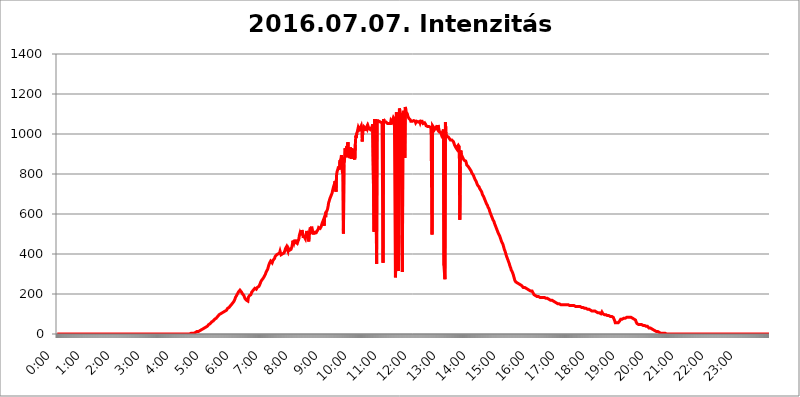
| Category | 2016.07.07. Intenzitás [W/m^2] |
|---|---|
| 0.0 | 0 |
| 0.0006944444444444445 | 0 |
| 0.001388888888888889 | 0 |
| 0.0020833333333333333 | 0 |
| 0.002777777777777778 | 0 |
| 0.003472222222222222 | 0 |
| 0.004166666666666667 | 0 |
| 0.004861111111111111 | 0 |
| 0.005555555555555556 | 0 |
| 0.0062499999999999995 | 0 |
| 0.006944444444444444 | 0 |
| 0.007638888888888889 | 0 |
| 0.008333333333333333 | 0 |
| 0.009027777777777779 | 0 |
| 0.009722222222222222 | 0 |
| 0.010416666666666666 | 0 |
| 0.011111111111111112 | 0 |
| 0.011805555555555555 | 0 |
| 0.012499999999999999 | 0 |
| 0.013194444444444444 | 0 |
| 0.013888888888888888 | 0 |
| 0.014583333333333332 | 0 |
| 0.015277777777777777 | 0 |
| 0.015972222222222224 | 0 |
| 0.016666666666666666 | 0 |
| 0.017361111111111112 | 0 |
| 0.018055555555555557 | 0 |
| 0.01875 | 0 |
| 0.019444444444444445 | 0 |
| 0.02013888888888889 | 0 |
| 0.020833333333333332 | 0 |
| 0.02152777777777778 | 0 |
| 0.022222222222222223 | 0 |
| 0.02291666666666667 | 0 |
| 0.02361111111111111 | 0 |
| 0.024305555555555556 | 0 |
| 0.024999999999999998 | 0 |
| 0.025694444444444447 | 0 |
| 0.02638888888888889 | 0 |
| 0.027083333333333334 | 0 |
| 0.027777777777777776 | 0 |
| 0.02847222222222222 | 0 |
| 0.029166666666666664 | 0 |
| 0.029861111111111113 | 0 |
| 0.030555555555555555 | 0 |
| 0.03125 | 0 |
| 0.03194444444444445 | 0 |
| 0.03263888888888889 | 0 |
| 0.03333333333333333 | 0 |
| 0.034027777777777775 | 0 |
| 0.034722222222222224 | 0 |
| 0.035416666666666666 | 0 |
| 0.036111111111111115 | 0 |
| 0.03680555555555556 | 0 |
| 0.0375 | 0 |
| 0.03819444444444444 | 0 |
| 0.03888888888888889 | 0 |
| 0.03958333333333333 | 0 |
| 0.04027777777777778 | 0 |
| 0.04097222222222222 | 0 |
| 0.041666666666666664 | 0 |
| 0.042361111111111106 | 0 |
| 0.04305555555555556 | 0 |
| 0.043750000000000004 | 0 |
| 0.044444444444444446 | 0 |
| 0.04513888888888889 | 0 |
| 0.04583333333333334 | 0 |
| 0.04652777777777778 | 0 |
| 0.04722222222222222 | 0 |
| 0.04791666666666666 | 0 |
| 0.04861111111111111 | 0 |
| 0.049305555555555554 | 0 |
| 0.049999999999999996 | 0 |
| 0.05069444444444445 | 0 |
| 0.051388888888888894 | 0 |
| 0.052083333333333336 | 0 |
| 0.05277777777777778 | 0 |
| 0.05347222222222222 | 0 |
| 0.05416666666666667 | 0 |
| 0.05486111111111111 | 0 |
| 0.05555555555555555 | 0 |
| 0.05625 | 0 |
| 0.05694444444444444 | 0 |
| 0.057638888888888885 | 0 |
| 0.05833333333333333 | 0 |
| 0.05902777777777778 | 0 |
| 0.059722222222222225 | 0 |
| 0.06041666666666667 | 0 |
| 0.061111111111111116 | 0 |
| 0.06180555555555556 | 0 |
| 0.0625 | 0 |
| 0.06319444444444444 | 0 |
| 0.06388888888888888 | 0 |
| 0.06458333333333334 | 0 |
| 0.06527777777777778 | 0 |
| 0.06597222222222222 | 0 |
| 0.06666666666666667 | 0 |
| 0.06736111111111111 | 0 |
| 0.06805555555555555 | 0 |
| 0.06874999999999999 | 0 |
| 0.06944444444444443 | 0 |
| 0.07013888888888889 | 0 |
| 0.07083333333333333 | 0 |
| 0.07152777777777779 | 0 |
| 0.07222222222222223 | 0 |
| 0.07291666666666667 | 0 |
| 0.07361111111111111 | 0 |
| 0.07430555555555556 | 0 |
| 0.075 | 0 |
| 0.07569444444444444 | 0 |
| 0.0763888888888889 | 0 |
| 0.07708333333333334 | 0 |
| 0.07777777777777778 | 0 |
| 0.07847222222222222 | 0 |
| 0.07916666666666666 | 0 |
| 0.0798611111111111 | 0 |
| 0.08055555555555556 | 0 |
| 0.08125 | 0 |
| 0.08194444444444444 | 0 |
| 0.08263888888888889 | 0 |
| 0.08333333333333333 | 0 |
| 0.08402777777777777 | 0 |
| 0.08472222222222221 | 0 |
| 0.08541666666666665 | 0 |
| 0.08611111111111112 | 0 |
| 0.08680555555555557 | 0 |
| 0.08750000000000001 | 0 |
| 0.08819444444444445 | 0 |
| 0.08888888888888889 | 0 |
| 0.08958333333333333 | 0 |
| 0.09027777777777778 | 0 |
| 0.09097222222222222 | 0 |
| 0.09166666666666667 | 0 |
| 0.09236111111111112 | 0 |
| 0.09305555555555556 | 0 |
| 0.09375 | 0 |
| 0.09444444444444444 | 0 |
| 0.09513888888888888 | 0 |
| 0.09583333333333333 | 0 |
| 0.09652777777777777 | 0 |
| 0.09722222222222222 | 0 |
| 0.09791666666666667 | 0 |
| 0.09861111111111111 | 0 |
| 0.09930555555555555 | 0 |
| 0.09999999999999999 | 0 |
| 0.10069444444444443 | 0 |
| 0.1013888888888889 | 0 |
| 0.10208333333333335 | 0 |
| 0.10277777777777779 | 0 |
| 0.10347222222222223 | 0 |
| 0.10416666666666667 | 0 |
| 0.10486111111111111 | 0 |
| 0.10555555555555556 | 0 |
| 0.10625 | 0 |
| 0.10694444444444444 | 0 |
| 0.1076388888888889 | 0 |
| 0.10833333333333334 | 0 |
| 0.10902777777777778 | 0 |
| 0.10972222222222222 | 0 |
| 0.1111111111111111 | 0 |
| 0.11180555555555556 | 0 |
| 0.11180555555555556 | 0 |
| 0.1125 | 0 |
| 0.11319444444444444 | 0 |
| 0.11388888888888889 | 0 |
| 0.11458333333333333 | 0 |
| 0.11527777777777777 | 0 |
| 0.11597222222222221 | 0 |
| 0.11666666666666665 | 0 |
| 0.1173611111111111 | 0 |
| 0.11805555555555557 | 0 |
| 0.11944444444444445 | 0 |
| 0.12013888888888889 | 0 |
| 0.12083333333333333 | 0 |
| 0.12152777777777778 | 0 |
| 0.12222222222222223 | 0 |
| 0.12291666666666667 | 0 |
| 0.12291666666666667 | 0 |
| 0.12361111111111112 | 0 |
| 0.12430555555555556 | 0 |
| 0.125 | 0 |
| 0.12569444444444444 | 0 |
| 0.12638888888888888 | 0 |
| 0.12708333333333333 | 0 |
| 0.16875 | 0 |
| 0.12847222222222224 | 0 |
| 0.12916666666666668 | 0 |
| 0.12986111111111112 | 0 |
| 0.13055555555555556 | 0 |
| 0.13125 | 0 |
| 0.13194444444444445 | 0 |
| 0.1326388888888889 | 0 |
| 0.13333333333333333 | 0 |
| 0.13402777777777777 | 0 |
| 0.13402777777777777 | 0 |
| 0.13472222222222222 | 0 |
| 0.13541666666666666 | 0 |
| 0.1361111111111111 | 0 |
| 0.13749999999999998 | 0 |
| 0.13819444444444443 | 0 |
| 0.1388888888888889 | 0 |
| 0.13958333333333334 | 0 |
| 0.14027777777777778 | 0 |
| 0.14097222222222222 | 0 |
| 0.14166666666666666 | 0 |
| 0.1423611111111111 | 0 |
| 0.14305555555555557 | 0 |
| 0.14375000000000002 | 0 |
| 0.14444444444444446 | 0 |
| 0.1451388888888889 | 0 |
| 0.1451388888888889 | 0 |
| 0.14652777777777778 | 0 |
| 0.14722222222222223 | 0 |
| 0.14791666666666667 | 0 |
| 0.1486111111111111 | 0 |
| 0.14930555555555555 | 0 |
| 0.15 | 0 |
| 0.15069444444444444 | 0 |
| 0.15138888888888888 | 0 |
| 0.15208333333333332 | 0 |
| 0.15277777777777776 | 0 |
| 0.15347222222222223 | 0 |
| 0.15416666666666667 | 0 |
| 0.15486111111111112 | 0 |
| 0.15555555555555556 | 0 |
| 0.15625 | 0 |
| 0.15694444444444444 | 0 |
| 0.15763888888888888 | 0 |
| 0.15833333333333333 | 0 |
| 0.15902777777777777 | 0 |
| 0.15972222222222224 | 0 |
| 0.16041666666666668 | 0 |
| 0.16111111111111112 | 0 |
| 0.16180555555555556 | 0 |
| 0.1625 | 0 |
| 0.16319444444444445 | 0 |
| 0.1638888888888889 | 0 |
| 0.16458333333333333 | 0 |
| 0.16527777777777777 | 0 |
| 0.16597222222222222 | 0 |
| 0.16666666666666666 | 0 |
| 0.1673611111111111 | 0 |
| 0.16805555555555554 | 0 |
| 0.16874999999999998 | 0 |
| 0.16944444444444443 | 0 |
| 0.17013888888888887 | 0 |
| 0.1708333333333333 | 0 |
| 0.17152777777777775 | 0 |
| 0.17222222222222225 | 0 |
| 0.1729166666666667 | 0 |
| 0.17361111111111113 | 0 |
| 0.17430555555555557 | 0 |
| 0.17500000000000002 | 0 |
| 0.17569444444444446 | 0 |
| 0.1763888888888889 | 0 |
| 0.17708333333333334 | 0 |
| 0.17777777777777778 | 0 |
| 0.17847222222222223 | 0 |
| 0.17916666666666667 | 0 |
| 0.1798611111111111 | 0 |
| 0.18055555555555555 | 0 |
| 0.18125 | 0 |
| 0.18194444444444444 | 0 |
| 0.1826388888888889 | 0 |
| 0.18333333333333335 | 0 |
| 0.1840277777777778 | 0 |
| 0.18472222222222223 | 3.525 |
| 0.18541666666666667 | 0 |
| 0.18611111111111112 | 3.525 |
| 0.18680555555555556 | 3.525 |
| 0.1875 | 3.525 |
| 0.18819444444444444 | 3.525 |
| 0.18888888888888888 | 3.525 |
| 0.18958333333333333 | 3.525 |
| 0.19027777777777777 | 3.525 |
| 0.1909722222222222 | 3.525 |
| 0.19166666666666665 | 3.525 |
| 0.19236111111111112 | 7.887 |
| 0.19305555555555554 | 7.887 |
| 0.19375 | 7.887 |
| 0.19444444444444445 | 7.887 |
| 0.1951388888888889 | 7.887 |
| 0.19583333333333333 | 12.257 |
| 0.19652777777777777 | 12.257 |
| 0.19722222222222222 | 12.257 |
| 0.19791666666666666 | 12.257 |
| 0.1986111111111111 | 12.257 |
| 0.19930555555555554 | 16.636 |
| 0.19999999999999998 | 16.636 |
| 0.20069444444444443 | 21.024 |
| 0.20138888888888887 | 21.024 |
| 0.2020833333333333 | 21.024 |
| 0.2027777777777778 | 21.024 |
| 0.2034722222222222 | 25.419 |
| 0.2041666666666667 | 25.419 |
| 0.20486111111111113 | 25.419 |
| 0.20555555555555557 | 29.823 |
| 0.20625000000000002 | 29.823 |
| 0.20694444444444446 | 29.823 |
| 0.2076388888888889 | 29.823 |
| 0.20833333333333334 | 34.234 |
| 0.20902777777777778 | 34.234 |
| 0.20972222222222223 | 38.653 |
| 0.21041666666666667 | 38.653 |
| 0.2111111111111111 | 43.079 |
| 0.21180555555555555 | 43.079 |
| 0.2125 | 47.511 |
| 0.21319444444444444 | 47.511 |
| 0.2138888888888889 | 51.951 |
| 0.21458333333333335 | 51.951 |
| 0.2152777777777778 | 56.398 |
| 0.21597222222222223 | 56.398 |
| 0.21666666666666667 | 60.85 |
| 0.21736111111111112 | 60.85 |
| 0.21805555555555556 | 65.31 |
| 0.21875 | 65.31 |
| 0.21944444444444444 | 69.775 |
| 0.22013888888888888 | 69.775 |
| 0.22083333333333333 | 74.246 |
| 0.22152777777777777 | 74.246 |
| 0.2222222222222222 | 78.722 |
| 0.22291666666666665 | 78.722 |
| 0.2236111111111111 | 83.205 |
| 0.22430555555555556 | 83.205 |
| 0.225 | 87.692 |
| 0.22569444444444445 | 92.184 |
| 0.2263888888888889 | 92.184 |
| 0.22708333333333333 | 96.682 |
| 0.22777777777777777 | 96.682 |
| 0.22847222222222222 | 101.184 |
| 0.22916666666666666 | 101.184 |
| 0.2298611111111111 | 105.69 |
| 0.23055555555555554 | 105.69 |
| 0.23124999999999998 | 105.69 |
| 0.23194444444444443 | 110.201 |
| 0.23263888888888887 | 110.201 |
| 0.2333333333333333 | 110.201 |
| 0.2340277777777778 | 114.716 |
| 0.2347222222222222 | 114.716 |
| 0.2354166666666667 | 114.716 |
| 0.23611111111111113 | 119.235 |
| 0.23680555555555557 | 119.235 |
| 0.23750000000000002 | 119.235 |
| 0.23819444444444446 | 123.758 |
| 0.2388888888888889 | 128.284 |
| 0.23958333333333334 | 128.284 |
| 0.24027777777777778 | 128.284 |
| 0.24097222222222223 | 132.814 |
| 0.24166666666666667 | 137.347 |
| 0.2423611111111111 | 137.347 |
| 0.24305555555555555 | 141.884 |
| 0.24375 | 146.423 |
| 0.24444444444444446 | 146.423 |
| 0.24513888888888888 | 150.964 |
| 0.24583333333333335 | 150.964 |
| 0.2465277777777778 | 155.509 |
| 0.24722222222222223 | 160.056 |
| 0.24791666666666667 | 164.605 |
| 0.24861111111111112 | 169.156 |
| 0.24930555555555556 | 173.709 |
| 0.25 | 182.82 |
| 0.25069444444444444 | 182.82 |
| 0.2513888888888889 | 191.937 |
| 0.2520833333333333 | 196.497 |
| 0.25277777777777777 | 201.058 |
| 0.2534722222222222 | 201.058 |
| 0.25416666666666665 | 210.182 |
| 0.2548611111111111 | 210.182 |
| 0.2555555555555556 | 214.746 |
| 0.25625000000000003 | 219.309 |
| 0.2569444444444445 | 219.309 |
| 0.2576388888888889 | 214.746 |
| 0.25833333333333336 | 210.182 |
| 0.2590277777777778 | 205.62 |
| 0.25972222222222224 | 201.058 |
| 0.2604166666666667 | 196.497 |
| 0.2611111111111111 | 196.497 |
| 0.26180555555555557 | 191.937 |
| 0.2625 | 191.937 |
| 0.26319444444444445 | 178.264 |
| 0.2638888888888889 | 173.709 |
| 0.26458333333333334 | 173.709 |
| 0.2652777777777778 | 169.156 |
| 0.2659722222222222 | 164.605 |
| 0.26666666666666666 | 169.156 |
| 0.2673611111111111 | 164.605 |
| 0.26805555555555555 | 182.82 |
| 0.26875 | 178.264 |
| 0.26944444444444443 | 191.937 |
| 0.2701388888888889 | 196.497 |
| 0.2708333333333333 | 196.497 |
| 0.27152777777777776 | 196.497 |
| 0.2722222222222222 | 201.058 |
| 0.27291666666666664 | 210.182 |
| 0.2736111111111111 | 214.746 |
| 0.2743055555555555 | 214.746 |
| 0.27499999999999997 | 219.309 |
| 0.27569444444444446 | 223.873 |
| 0.27638888888888885 | 223.873 |
| 0.27708333333333335 | 228.436 |
| 0.2777777777777778 | 228.436 |
| 0.27847222222222223 | 228.436 |
| 0.2791666666666667 | 223.873 |
| 0.2798611111111111 | 228.436 |
| 0.28055555555555556 | 233 |
| 0.28125 | 237.564 |
| 0.28194444444444444 | 233 |
| 0.2826388888888889 | 237.564 |
| 0.2833333333333333 | 242.127 |
| 0.28402777777777777 | 246.689 |
| 0.2847222222222222 | 251.251 |
| 0.28541666666666665 | 260.373 |
| 0.28611111111111115 | 264.932 |
| 0.28680555555555554 | 269.49 |
| 0.28750000000000003 | 269.49 |
| 0.2881944444444445 | 274.047 |
| 0.2888888888888889 | 278.603 |
| 0.28958333333333336 | 278.603 |
| 0.2902777777777778 | 287.709 |
| 0.29097222222222224 | 287.709 |
| 0.2916666666666667 | 296.808 |
| 0.2923611111111111 | 292.259 |
| 0.29305555555555557 | 310.44 |
| 0.29375 | 314.98 |
| 0.29444444444444445 | 314.98 |
| 0.2951388888888889 | 324.052 |
| 0.29583333333333334 | 333.113 |
| 0.2965277777777778 | 342.162 |
| 0.2972222222222222 | 346.682 |
| 0.29791666666666666 | 355.712 |
| 0.2986111111111111 | 360.221 |
| 0.29930555555555555 | 364.728 |
| 0.3 | 364.728 |
| 0.30069444444444443 | 364.728 |
| 0.3013888888888889 | 355.712 |
| 0.3020833333333333 | 360.221 |
| 0.30277777777777776 | 369.23 |
| 0.3034722222222222 | 369.23 |
| 0.30416666666666664 | 373.729 |
| 0.3048611111111111 | 378.224 |
| 0.3055555555555555 | 387.202 |
| 0.30624999999999997 | 382.715 |
| 0.3069444444444444 | 391.685 |
| 0.3076388888888889 | 396.164 |
| 0.30833333333333335 | 396.164 |
| 0.3090277777777778 | 396.164 |
| 0.30972222222222223 | 400.638 |
| 0.3104166666666667 | 396.164 |
| 0.3111111111111111 | 400.638 |
| 0.31180555555555556 | 405.108 |
| 0.3125 | 414.035 |
| 0.31319444444444444 | 405.108 |
| 0.3138888888888889 | 396.164 |
| 0.3145833333333333 | 396.164 |
| 0.31527777777777777 | 396.164 |
| 0.3159722222222222 | 400.638 |
| 0.31666666666666665 | 400.638 |
| 0.31736111111111115 | 400.638 |
| 0.31805555555555554 | 405.108 |
| 0.31875000000000003 | 409.574 |
| 0.3194444444444445 | 418.492 |
| 0.3201388888888889 | 427.39 |
| 0.32083333333333336 | 422.943 |
| 0.3215277777777778 | 436.27 |
| 0.32222222222222224 | 427.39 |
| 0.3229166666666667 | 431.833 |
| 0.3236111111111111 | 414.035 |
| 0.32430555555555557 | 427.39 |
| 0.325 | 427.39 |
| 0.32569444444444445 | 418.492 |
| 0.3263888888888889 | 418.492 |
| 0.32708333333333334 | 418.492 |
| 0.3277777777777778 | 422.943 |
| 0.3284722222222222 | 427.39 |
| 0.32916666666666666 | 436.27 |
| 0.3298611111111111 | 449.551 |
| 0.33055555555555555 | 467.187 |
| 0.33125 | 462.786 |
| 0.33194444444444443 | 453.968 |
| 0.3326388888888889 | 458.38 |
| 0.3333333333333333 | 471.582 |
| 0.3340277777777778 | 458.38 |
| 0.3347222222222222 | 462.786 |
| 0.3354166666666667 | 458.38 |
| 0.3361111111111111 | 453.968 |
| 0.3368055555555556 | 471.582 |
| 0.33749999999999997 | 462.786 |
| 0.33819444444444446 | 467.187 |
| 0.33888888888888885 | 475.972 |
| 0.33958333333333335 | 493.475 |
| 0.34027777777777773 | 502.192 |
| 0.34097222222222223 | 493.475 |
| 0.3416666666666666 | 515.223 |
| 0.3423611111111111 | 502.192 |
| 0.3430555555555555 | 519.555 |
| 0.34375 | 510.885 |
| 0.3444444444444445 | 497.836 |
| 0.3451388888888889 | 480.356 |
| 0.3458333333333334 | 493.475 |
| 0.34652777777777777 | 484.735 |
| 0.34722222222222227 | 480.356 |
| 0.34791666666666665 | 475.972 |
| 0.34861111111111115 | 493.475 |
| 0.34930555555555554 | 502.192 |
| 0.35000000000000003 | 515.223 |
| 0.3506944444444444 | 515.223 |
| 0.3513888888888889 | 497.836 |
| 0.3520833333333333 | 502.192 |
| 0.3527777777777778 | 462.786 |
| 0.3534722222222222 | 510.885 |
| 0.3541666666666667 | 497.836 |
| 0.3548611111111111 | 532.513 |
| 0.35555555555555557 | 523.88 |
| 0.35625 | 523.88 |
| 0.35694444444444445 | 536.82 |
| 0.3576388888888889 | 502.192 |
| 0.35833333333333334 | 510.885 |
| 0.3590277777777778 | 506.542 |
| 0.3597222222222222 | 497.836 |
| 0.36041666666666666 | 515.223 |
| 0.3611111111111111 | 506.542 |
| 0.36180555555555555 | 502.192 |
| 0.3625 | 506.542 |
| 0.36319444444444443 | 506.542 |
| 0.3638888888888889 | 510.885 |
| 0.3645833333333333 | 515.223 |
| 0.3652777777777778 | 515.223 |
| 0.3659722222222222 | 523.88 |
| 0.3666666666666667 | 532.513 |
| 0.3673611111111111 | 532.513 |
| 0.3680555555555556 | 532.513 |
| 0.36874999999999997 | 528.2 |
| 0.36944444444444446 | 528.2 |
| 0.37013888888888885 | 536.82 |
| 0.37083333333333335 | 545.416 |
| 0.37152777777777773 | 553.986 |
| 0.37222222222222223 | 558.261 |
| 0.3729166666666666 | 566.793 |
| 0.3736111111111111 | 571.049 |
| 0.3743055555555555 | 541.121 |
| 0.375 | 583.779 |
| 0.3756944444444445 | 592.233 |
| 0.3763888888888889 | 583.779 |
| 0.3770833333333334 | 609.062 |
| 0.37777777777777777 | 609.062 |
| 0.37847222222222227 | 617.436 |
| 0.37916666666666665 | 625.784 |
| 0.37986111111111115 | 638.256 |
| 0.38055555555555554 | 654.791 |
| 0.38125000000000003 | 650.667 |
| 0.3819444444444444 | 671.22 |
| 0.3826388888888889 | 679.395 |
| 0.3833333333333333 | 679.395 |
| 0.3840277777777778 | 691.608 |
| 0.3847222222222222 | 695.666 |
| 0.3854166666666667 | 703.762 |
| 0.3861111111111111 | 715.858 |
| 0.38680555555555557 | 719.877 |
| 0.3875 | 735.89 |
| 0.38819444444444445 | 743.859 |
| 0.3888888888888889 | 751.803 |
| 0.38958333333333334 | 763.674 |
| 0.3902777777777778 | 763.674 |
| 0.3909722222222222 | 711.832 |
| 0.39166666666666666 | 791.169 |
| 0.3923611111111111 | 810.641 |
| 0.39305555555555555 | 814.519 |
| 0.39375 | 826.123 |
| 0.39444444444444443 | 837.682 |
| 0.3951388888888889 | 841.526 |
| 0.3958333333333333 | 822.26 |
| 0.3965277777777778 | 868.305 |
| 0.3972222222222222 | 860.676 |
| 0.3979166666666667 | 875.918 |
| 0.3986111111111111 | 894.885 |
| 0.3993055555555556 | 860.676 |
| 0.39999999999999997 | 802.868 |
| 0.40069444444444446 | 883.516 |
| 0.40138888888888885 | 502.192 |
| 0.40208333333333335 | 849.199 |
| 0.40277777777777773 | 860.676 |
| 0.40347222222222223 | 928.819 |
| 0.4041666666666666 | 925.06 |
| 0.4048611111111111 | 917.534 |
| 0.4055555555555555 | 921.298 |
| 0.40625 | 940.082 |
| 0.4069444444444445 | 883.516 |
| 0.4076388888888889 | 958.814 |
| 0.4083333333333334 | 906.223 |
| 0.40902777777777777 | 906.223 |
| 0.40972222222222227 | 906.223 |
| 0.41041666666666665 | 879.719 |
| 0.41111111111111115 | 932.576 |
| 0.41180555555555554 | 936.33 |
| 0.41250000000000003 | 875.918 |
| 0.4131944444444444 | 928.819 |
| 0.4138888888888889 | 879.719 |
| 0.4145833333333333 | 887.309 |
| 0.4152777777777778 | 925.06 |
| 0.4159722222222222 | 883.516 |
| 0.4166666666666667 | 883.516 |
| 0.4173611111111111 | 872.114 |
| 0.41805555555555557 | 947.58 |
| 0.41875 | 992.448 |
| 0.41944444444444445 | 981.244 |
| 0.4201388888888889 | 1003.65 |
| 0.42083333333333334 | 1011.118 |
| 0.4215277777777778 | 1014.852 |
| 0.4222222222222222 | 1033.537 |
| 0.42291666666666666 | 1037.277 |
| 0.4236111111111111 | 1022.323 |
| 0.42430555555555555 | 1022.323 |
| 0.425 | 1029.798 |
| 0.42569444444444443 | 1026.06 |
| 0.4263888888888889 | 1041.019 |
| 0.4270833333333333 | 1026.06 |
| 0.4277777777777778 | 962.555 |
| 0.4284722222222222 | 1007.383 |
| 0.4291666666666667 | 1029.798 |
| 0.4298611111111111 | 1037.277 |
| 0.4305555555555556 | 1041.019 |
| 0.43124999999999997 | 1033.537 |
| 0.43194444444444446 | 1029.798 |
| 0.43263888888888885 | 1014.852 |
| 0.43333333333333335 | 1029.798 |
| 0.43402777777777773 | 1033.537 |
| 0.43472222222222223 | 1041.019 |
| 0.4354166666666666 | 1029.798 |
| 0.4361111111111111 | 1037.277 |
| 0.4368055555555555 | 1029.798 |
| 0.4375 | 1029.798 |
| 0.4381944444444445 | 1026.06 |
| 0.4388888888888889 | 1022.323 |
| 0.4395833333333334 | 1026.06 |
| 0.44027777777777777 | 1029.798 |
| 0.44097222222222227 | 1033.537 |
| 0.44166666666666665 | 1037.277 |
| 0.44236111111111115 | 1048.508 |
| 0.44305555555555554 | 1052.255 |
| 0.44375000000000003 | 1048.508 |
| 0.4444444444444444 | 510.885 |
| 0.4451388888888889 | 1074.789 |
| 0.4458333333333333 | 970.034 |
| 0.4465277777777778 | 1074.789 |
| 0.4472222222222222 | 1074.789 |
| 0.4479166666666667 | 351.198 |
| 0.4486111111111111 | 1071.027 |
| 0.44930555555555557 | 1063.51 |
| 0.45 | 1067.267 |
| 0.45069444444444445 | 1063.51 |
| 0.4513888888888889 | 1063.51 |
| 0.45208333333333334 | 1063.51 |
| 0.4527777777777778 | 1067.267 |
| 0.4534722222222222 | 1059.756 |
| 0.45416666666666666 | 1059.756 |
| 0.4548611111111111 | 1059.756 |
| 0.45555555555555555 | 1056.004 |
| 0.45625 | 1052.255 |
| 0.45694444444444443 | 355.712 |
| 0.4576388888888889 | 1074.789 |
| 0.4583333333333333 | 1067.267 |
| 0.4590277777777778 | 1059.756 |
| 0.4597222222222222 | 1059.756 |
| 0.4604166666666667 | 1063.51 |
| 0.4611111111111111 | 1059.756 |
| 0.4618055555555556 | 1056.004 |
| 0.46249999999999997 | 1056.004 |
| 0.46319444444444446 | 1052.255 |
| 0.46388888888888885 | 1052.255 |
| 0.46458333333333335 | 1052.255 |
| 0.46527777777777773 | 1052.255 |
| 0.46597222222222223 | 1052.255 |
| 0.4666666666666666 | 1056.004 |
| 0.4673611111111111 | 1052.255 |
| 0.4680555555555555 | 1067.267 |
| 0.46875 | 1063.51 |
| 0.4694444444444445 | 1059.756 |
| 0.4701388888888889 | 1059.756 |
| 0.4708333333333334 | 1063.51 |
| 0.47152777777777777 | 1082.324 |
| 0.47222222222222227 | 1082.324 |
| 0.47291666666666665 | 1074.789 |
| 0.47361111111111115 | 1078.555 |
| 0.47430555555555554 | 283.156 |
| 0.47500000000000003 | 355.712 |
| 0.4756944444444444 | 1108.816 |
| 0.4763888888888889 | 414.035 |
| 0.4770833333333333 | 519.555 |
| 0.4777777777777778 | 378.224 |
| 0.4784722222222222 | 314.98 |
| 0.4791666666666667 | 493.475 |
| 0.4798611111111111 | 1127.879 |
| 0.48055555555555557 | 1116.426 |
| 0.48125 | 1105.019 |
| 0.48194444444444445 | 1093.653 |
| 0.4826388888888889 | 1089.873 |
| 0.48333333333333334 | 1097.437 |
| 0.4840277777777778 | 310.44 |
| 0.4847222222222222 | 988.714 |
| 0.48541666666666666 | 1116.426 |
| 0.4861111111111111 | 1112.618 |
| 0.48680555555555555 | 1086.097 |
| 0.4875 | 879.719 |
| 0.48819444444444443 | 1135.543 |
| 0.4888888888888889 | 1120.238 |
| 0.4895833333333333 | 1108.816 |
| 0.4902777777777778 | 1108.816 |
| 0.4909722222222222 | 1101.226 |
| 0.4916666666666667 | 1089.873 |
| 0.4923611111111111 | 1086.097 |
| 0.4930555555555556 | 1078.555 |
| 0.49374999999999997 | 1078.555 |
| 0.49444444444444446 | 1074.789 |
| 0.49513888888888885 | 1071.027 |
| 0.49583333333333335 | 1063.51 |
| 0.49652777777777773 | 1063.51 |
| 0.49722222222222223 | 1063.51 |
| 0.4979166666666666 | 1063.51 |
| 0.4986111111111111 | 1063.51 |
| 0.4993055555555555 | 1063.51 |
| 0.5 | 1067.267 |
| 0.5006944444444444 | 1067.267 |
| 0.5013888888888889 | 1067.267 |
| 0.5020833333333333 | 1063.51 |
| 0.5027777777777778 | 1056.004 |
| 0.5034722222222222 | 1059.756 |
| 0.5041666666666667 | 1063.51 |
| 0.5048611111111111 | 1063.51 |
| 0.5055555555555555 | 1063.51 |
| 0.50625 | 1059.756 |
| 0.5069444444444444 | 1063.51 |
| 0.5076388888888889 | 1063.51 |
| 0.5083333333333333 | 1063.51 |
| 0.5090277777777777 | 1056.004 |
| 0.5097222222222222 | 1063.51 |
| 0.5104166666666666 | 1063.51 |
| 0.5111111111111112 | 1063.51 |
| 0.5118055555555555 | 1063.51 |
| 0.5125000000000001 | 1059.756 |
| 0.5131944444444444 | 1052.255 |
| 0.513888888888889 | 1048.508 |
| 0.5145833333333333 | 1052.255 |
| 0.5152777777777778 | 1056.004 |
| 0.5159722222222222 | 1052.255 |
| 0.5166666666666667 | 1048.508 |
| 0.517361111111111 | 1041.019 |
| 0.5180555555555556 | 1041.019 |
| 0.5187499999999999 | 1037.277 |
| 0.5194444444444445 | 1037.277 |
| 0.5201388888888888 | 1037.277 |
| 0.5208333333333334 | 1033.537 |
| 0.5215277777777778 | 1037.277 |
| 0.5222222222222223 | 1037.277 |
| 0.5229166666666667 | 1037.277 |
| 0.5236111111111111 | 1033.537 |
| 0.5243055555555556 | 1026.06 |
| 0.525 | 1026.06 |
| 0.5256944444444445 | 497.836 |
| 0.5263888888888889 | 1041.019 |
| 0.5270833333333333 | 1037.277 |
| 0.5277777777777778 | 1033.537 |
| 0.5284722222222222 | 1029.798 |
| 0.5291666666666667 | 1022.323 |
| 0.5298611111111111 | 1022.323 |
| 0.5305555555555556 | 1022.323 |
| 0.53125 | 1033.537 |
| 0.5319444444444444 | 1029.798 |
| 0.5326388888888889 | 1033.537 |
| 0.5333333333333333 | 1022.323 |
| 0.5340277777777778 | 1044.762 |
| 0.5347222222222222 | 1033.537 |
| 0.5354166666666667 | 1022.323 |
| 0.5361111111111111 | 1011.118 |
| 0.5368055555555555 | 1007.383 |
| 0.5375 | 1007.383 |
| 0.5381944444444444 | 1003.65 |
| 0.5388888888888889 | 996.182 |
| 0.5395833333333333 | 996.182 |
| 0.5402777777777777 | 999.916 |
| 0.5409722222222222 | 1014.852 |
| 0.5416666666666666 | 1022.323 |
| 0.5423611111111112 | 342.162 |
| 0.5430555555555555 | 305.898 |
| 0.5437500000000001 | 274.047 |
| 0.5444444444444444 | 1059.756 |
| 0.545138888888889 | 1003.65 |
| 0.5458333333333333 | 1003.65 |
| 0.5465277777777778 | 988.714 |
| 0.5472222222222222 | 988.714 |
| 0.5479166666666667 | 988.714 |
| 0.548611111111111 | 984.98 |
| 0.5493055555555556 | 981.244 |
| 0.5499999999999999 | 977.508 |
| 0.5506944444444445 | 973.772 |
| 0.5513888888888888 | 970.034 |
| 0.5520833333333334 | 973.772 |
| 0.5527777777777778 | 973.772 |
| 0.5534722222222223 | 970.034 |
| 0.5541666666666667 | 970.034 |
| 0.5548611111111111 | 970.034 |
| 0.5555555555555556 | 962.555 |
| 0.55625 | 955.071 |
| 0.5569444444444445 | 947.58 |
| 0.5576388888888889 | 947.58 |
| 0.5583333333333333 | 943.832 |
| 0.5590277777777778 | 932.576 |
| 0.5597222222222222 | 932.576 |
| 0.5604166666666667 | 925.06 |
| 0.5611111111111111 | 936.33 |
| 0.5618055555555556 | 940.082 |
| 0.5625 | 943.832 |
| 0.5631944444444444 | 940.082 |
| 0.5638888888888889 | 936.33 |
| 0.5645833333333333 | 571.049 |
| 0.5652777777777778 | 837.682 |
| 0.5659722222222222 | 917.534 |
| 0.5666666666666667 | 898.668 |
| 0.5673611111111111 | 894.885 |
| 0.5680555555555555 | 887.309 |
| 0.56875 | 883.516 |
| 0.5694444444444444 | 875.918 |
| 0.5701388888888889 | 875.918 |
| 0.5708333333333333 | 868.305 |
| 0.5715277777777777 | 868.305 |
| 0.5722222222222222 | 868.305 |
| 0.5729166666666666 | 864.493 |
| 0.5736111111111112 | 856.855 |
| 0.5743055555555555 | 845.365 |
| 0.5750000000000001 | 845.365 |
| 0.5756944444444444 | 841.526 |
| 0.576388888888889 | 837.682 |
| 0.5770833333333333 | 833.834 |
| 0.5777777777777778 | 829.981 |
| 0.5784722222222222 | 826.123 |
| 0.5791666666666667 | 822.26 |
| 0.579861111111111 | 818.392 |
| 0.5805555555555556 | 814.519 |
| 0.5812499999999999 | 806.757 |
| 0.5819444444444445 | 802.868 |
| 0.5826388888888888 | 798.974 |
| 0.5833333333333334 | 795.074 |
| 0.5840277777777778 | 791.169 |
| 0.5847222222222223 | 783.342 |
| 0.5854166666666667 | 779.42 |
| 0.5861111111111111 | 771.559 |
| 0.5868055555555556 | 767.62 |
| 0.5875 | 763.674 |
| 0.5881944444444445 | 755.766 |
| 0.5888888888888889 | 751.803 |
| 0.5895833333333333 | 743.859 |
| 0.5902777777777778 | 743.859 |
| 0.5909722222222222 | 743.859 |
| 0.5916666666666667 | 735.89 |
| 0.5923611111111111 | 727.896 |
| 0.5930555555555556 | 723.889 |
| 0.59375 | 719.877 |
| 0.5944444444444444 | 715.858 |
| 0.5951388888888889 | 711.832 |
| 0.5958333333333333 | 707.8 |
| 0.5965277777777778 | 695.666 |
| 0.5972222222222222 | 691.608 |
| 0.5979166666666667 | 687.544 |
| 0.5986111111111111 | 683.473 |
| 0.5993055555555555 | 675.311 |
| 0.6 | 671.22 |
| 0.6006944444444444 | 663.019 |
| 0.6013888888888889 | 658.909 |
| 0.6020833333333333 | 650.667 |
| 0.6027777777777777 | 646.537 |
| 0.6034722222222222 | 642.4 |
| 0.6041666666666666 | 634.105 |
| 0.6048611111111112 | 629.948 |
| 0.6055555555555555 | 625.784 |
| 0.6062500000000001 | 617.436 |
| 0.6069444444444444 | 609.062 |
| 0.607638888888889 | 604.864 |
| 0.6083333333333333 | 596.45 |
| 0.6090277777777778 | 592.233 |
| 0.6097222222222222 | 583.779 |
| 0.6104166666666667 | 579.542 |
| 0.611111111111111 | 571.049 |
| 0.6118055555555556 | 566.793 |
| 0.6124999999999999 | 562.53 |
| 0.6131944444444445 | 553.986 |
| 0.6138888888888888 | 549.704 |
| 0.6145833333333334 | 541.121 |
| 0.6152777777777778 | 536.82 |
| 0.6159722222222223 | 528.2 |
| 0.6166666666666667 | 523.88 |
| 0.6173611111111111 | 515.223 |
| 0.6180555555555556 | 510.885 |
| 0.61875 | 502.192 |
| 0.6194444444444445 | 497.836 |
| 0.6201388888888889 | 493.475 |
| 0.6208333333333333 | 489.108 |
| 0.6215277777777778 | 480.356 |
| 0.6222222222222222 | 471.582 |
| 0.6229166666666667 | 467.187 |
| 0.6236111111111111 | 458.38 |
| 0.6243055555555556 | 453.968 |
| 0.625 | 449.551 |
| 0.6256944444444444 | 440.702 |
| 0.6263888888888889 | 431.833 |
| 0.6270833333333333 | 422.943 |
| 0.6277777777777778 | 418.492 |
| 0.6284722222222222 | 409.574 |
| 0.6291666666666667 | 400.638 |
| 0.6298611111111111 | 391.685 |
| 0.6305555555555555 | 387.202 |
| 0.63125 | 378.224 |
| 0.6319444444444444 | 373.729 |
| 0.6326388888888889 | 364.728 |
| 0.6333333333333333 | 360.221 |
| 0.6340277777777777 | 351.198 |
| 0.6347222222222222 | 342.162 |
| 0.6354166666666666 | 337.639 |
| 0.6361111111111112 | 328.584 |
| 0.6368055555555555 | 319.517 |
| 0.6375000000000001 | 314.98 |
| 0.6381944444444444 | 310.44 |
| 0.638888888888889 | 305.898 |
| 0.6395833333333333 | 296.808 |
| 0.6402777777777778 | 287.709 |
| 0.6409722222222222 | 278.603 |
| 0.6416666666666667 | 269.49 |
| 0.642361111111111 | 264.932 |
| 0.6430555555555556 | 260.373 |
| 0.6437499999999999 | 255.813 |
| 0.6444444444444445 | 255.813 |
| 0.6451388888888888 | 255.813 |
| 0.6458333333333334 | 255.813 |
| 0.6465277777777778 | 251.251 |
| 0.6472222222222223 | 251.251 |
| 0.6479166666666667 | 251.251 |
| 0.6486111111111111 | 246.689 |
| 0.6493055555555556 | 246.689 |
| 0.65 | 242.127 |
| 0.6506944444444445 | 242.127 |
| 0.6513888888888889 | 242.127 |
| 0.6520833333333333 | 242.127 |
| 0.6527777777777778 | 237.564 |
| 0.6534722222222222 | 233 |
| 0.6541666666666667 | 233 |
| 0.6548611111111111 | 233 |
| 0.6555555555555556 | 233 |
| 0.65625 | 228.436 |
| 0.6569444444444444 | 228.436 |
| 0.6576388888888889 | 228.436 |
| 0.6583333333333333 | 223.873 |
| 0.6590277777777778 | 223.873 |
| 0.6597222222222222 | 223.873 |
| 0.6604166666666667 | 223.873 |
| 0.6611111111111111 | 219.309 |
| 0.6618055555555555 | 219.309 |
| 0.6625 | 219.309 |
| 0.6631944444444444 | 219.309 |
| 0.6638888888888889 | 214.746 |
| 0.6645833333333333 | 214.746 |
| 0.6652777777777777 | 214.746 |
| 0.6659722222222222 | 214.746 |
| 0.6666666666666666 | 210.182 |
| 0.6673611111111111 | 205.62 |
| 0.6680555555555556 | 201.058 |
| 0.6687500000000001 | 196.497 |
| 0.6694444444444444 | 191.937 |
| 0.6701388888888888 | 191.937 |
| 0.6708333333333334 | 191.937 |
| 0.6715277777777778 | 187.378 |
| 0.6722222222222222 | 187.378 |
| 0.6729166666666666 | 187.378 |
| 0.6736111111111112 | 187.378 |
| 0.6743055555555556 | 187.378 |
| 0.6749999999999999 | 187.378 |
| 0.6756944444444444 | 187.378 |
| 0.6763888888888889 | 187.378 |
| 0.6770833333333334 | 182.82 |
| 0.6777777777777777 | 182.82 |
| 0.6784722222222223 | 187.378 |
| 0.6791666666666667 | 182.82 |
| 0.6798611111111111 | 182.82 |
| 0.6805555555555555 | 182.82 |
| 0.68125 | 182.82 |
| 0.6819444444444445 | 182.82 |
| 0.6826388888888889 | 182.82 |
| 0.6833333333333332 | 182.82 |
| 0.6840277777777778 | 182.82 |
| 0.6847222222222222 | 178.264 |
| 0.6854166666666667 | 178.264 |
| 0.686111111111111 | 178.264 |
| 0.6868055555555556 | 178.264 |
| 0.6875 | 178.264 |
| 0.6881944444444444 | 173.709 |
| 0.688888888888889 | 173.709 |
| 0.6895833333333333 | 173.709 |
| 0.6902777777777778 | 173.709 |
| 0.6909722222222222 | 173.709 |
| 0.6916666666666668 | 169.156 |
| 0.6923611111111111 | 169.156 |
| 0.6930555555555555 | 169.156 |
| 0.69375 | 169.156 |
| 0.6944444444444445 | 164.605 |
| 0.6951388888888889 | 164.605 |
| 0.6958333333333333 | 164.605 |
| 0.6965277777777777 | 164.605 |
| 0.6972222222222223 | 164.605 |
| 0.6979166666666666 | 160.056 |
| 0.6986111111111111 | 160.056 |
| 0.6993055555555556 | 160.056 |
| 0.7000000000000001 | 155.509 |
| 0.7006944444444444 | 155.509 |
| 0.7013888888888888 | 155.509 |
| 0.7020833333333334 | 150.964 |
| 0.7027777777777778 | 150.964 |
| 0.7034722222222222 | 150.964 |
| 0.7041666666666666 | 150.964 |
| 0.7048611111111112 | 150.964 |
| 0.7055555555555556 | 146.423 |
| 0.7062499999999999 | 146.423 |
| 0.7069444444444444 | 146.423 |
| 0.7076388888888889 | 146.423 |
| 0.7083333333333334 | 146.423 |
| 0.7090277777777777 | 146.423 |
| 0.7097222222222223 | 146.423 |
| 0.7104166666666667 | 146.423 |
| 0.7111111111111111 | 146.423 |
| 0.7118055555555555 | 146.423 |
| 0.7125 | 146.423 |
| 0.7131944444444445 | 146.423 |
| 0.7138888888888889 | 146.423 |
| 0.7145833333333332 | 146.423 |
| 0.7152777777777778 | 146.423 |
| 0.7159722222222222 | 146.423 |
| 0.7166666666666667 | 146.423 |
| 0.717361111111111 | 141.884 |
| 0.7180555555555556 | 141.884 |
| 0.71875 | 141.884 |
| 0.7194444444444444 | 141.884 |
| 0.720138888888889 | 141.884 |
| 0.7208333333333333 | 141.884 |
| 0.7215277777777778 | 141.884 |
| 0.7222222222222222 | 141.884 |
| 0.7229166666666668 | 141.884 |
| 0.7236111111111111 | 141.884 |
| 0.7243055555555555 | 141.884 |
| 0.725 | 141.884 |
| 0.7256944444444445 | 141.884 |
| 0.7263888888888889 | 141.884 |
| 0.7270833333333333 | 137.347 |
| 0.7277777777777777 | 137.347 |
| 0.7284722222222223 | 137.347 |
| 0.7291666666666666 | 137.347 |
| 0.7298611111111111 | 137.347 |
| 0.7305555555555556 | 137.347 |
| 0.7312500000000001 | 137.347 |
| 0.7319444444444444 | 137.347 |
| 0.7326388888888888 | 137.347 |
| 0.7333333333333334 | 137.347 |
| 0.7340277777777778 | 137.347 |
| 0.7347222222222222 | 137.347 |
| 0.7354166666666666 | 132.814 |
| 0.7361111111111112 | 132.814 |
| 0.7368055555555556 | 132.814 |
| 0.7374999999999999 | 132.814 |
| 0.7381944444444444 | 128.284 |
| 0.7388888888888889 | 132.814 |
| 0.7395833333333334 | 128.284 |
| 0.7402777777777777 | 128.284 |
| 0.7409722222222223 | 128.284 |
| 0.7416666666666667 | 128.284 |
| 0.7423611111111111 | 128.284 |
| 0.7430555555555555 | 128.284 |
| 0.74375 | 123.758 |
| 0.7444444444444445 | 123.758 |
| 0.7451388888888889 | 123.758 |
| 0.7458333333333332 | 123.758 |
| 0.7465277777777778 | 119.235 |
| 0.7472222222222222 | 119.235 |
| 0.7479166666666667 | 119.235 |
| 0.748611111111111 | 119.235 |
| 0.7493055555555556 | 119.235 |
| 0.75 | 114.716 |
| 0.7506944444444444 | 114.716 |
| 0.751388888888889 | 114.716 |
| 0.7520833333333333 | 114.716 |
| 0.7527777777777778 | 114.716 |
| 0.7534722222222222 | 110.201 |
| 0.7541666666666668 | 114.716 |
| 0.7548611111111111 | 110.201 |
| 0.7555555555555555 | 110.201 |
| 0.75625 | 110.201 |
| 0.7569444444444445 | 110.201 |
| 0.7576388888888889 | 110.201 |
| 0.7583333333333333 | 105.69 |
| 0.7590277777777777 | 105.69 |
| 0.7597222222222223 | 105.69 |
| 0.7604166666666666 | 105.69 |
| 0.7611111111111111 | 101.184 |
| 0.7618055555555556 | 101.184 |
| 0.7625000000000001 | 101.184 |
| 0.7631944444444444 | 105.69 |
| 0.7638888888888888 | 110.201 |
| 0.7645833333333334 | 105.69 |
| 0.7652777777777778 | 101.184 |
| 0.7659722222222222 | 101.184 |
| 0.7666666666666666 | 96.682 |
| 0.7673611111111112 | 96.682 |
| 0.7680555555555556 | 96.682 |
| 0.7687499999999999 | 96.682 |
| 0.7694444444444444 | 96.682 |
| 0.7701388888888889 | 92.184 |
| 0.7708333333333334 | 92.184 |
| 0.7715277777777777 | 92.184 |
| 0.7722222222222223 | 92.184 |
| 0.7729166666666667 | 92.184 |
| 0.7736111111111111 | 92.184 |
| 0.7743055555555555 | 92.184 |
| 0.775 | 92.184 |
| 0.7756944444444445 | 87.692 |
| 0.7763888888888889 | 87.692 |
| 0.7770833333333332 | 87.692 |
| 0.7777777777777778 | 87.692 |
| 0.7784722222222222 | 87.692 |
| 0.7791666666666667 | 87.692 |
| 0.779861111111111 | 83.205 |
| 0.7805555555555556 | 83.205 |
| 0.78125 | 78.722 |
| 0.7819444444444444 | 65.31 |
| 0.782638888888889 | 56.398 |
| 0.7833333333333333 | 51.951 |
| 0.7840277777777778 | 51.951 |
| 0.7847222222222222 | 56.398 |
| 0.7854166666666668 | 56.398 |
| 0.7861111111111111 | 56.398 |
| 0.7868055555555555 | 56.398 |
| 0.7875 | 56.398 |
| 0.7881944444444445 | 56.398 |
| 0.7888888888888889 | 65.31 |
| 0.7895833333333333 | 65.31 |
| 0.7902777777777777 | 74.246 |
| 0.7909722222222223 | 69.775 |
| 0.7916666666666666 | 74.246 |
| 0.7923611111111111 | 74.246 |
| 0.7930555555555556 | 74.246 |
| 0.7937500000000001 | 78.722 |
| 0.7944444444444444 | 78.722 |
| 0.7951388888888888 | 78.722 |
| 0.7958333333333334 | 78.722 |
| 0.7965277777777778 | 78.722 |
| 0.7972222222222222 | 78.722 |
| 0.7979166666666666 | 83.205 |
| 0.7986111111111112 | 83.205 |
| 0.7993055555555556 | 78.722 |
| 0.7999999999999999 | 78.722 |
| 0.8006944444444444 | 83.205 |
| 0.8013888888888889 | 83.205 |
| 0.8020833333333334 | 83.205 |
| 0.8027777777777777 | 83.205 |
| 0.8034722222222223 | 83.205 |
| 0.8041666666666667 | 83.205 |
| 0.8048611111111111 | 83.205 |
| 0.8055555555555555 | 83.205 |
| 0.80625 | 83.205 |
| 0.8069444444444445 | 78.722 |
| 0.8076388888888889 | 78.722 |
| 0.8083333333333332 | 78.722 |
| 0.8090277777777778 | 74.246 |
| 0.8097222222222222 | 74.246 |
| 0.8104166666666667 | 74.246 |
| 0.811111111111111 | 69.775 |
| 0.8118055555555556 | 60.85 |
| 0.8125 | 56.398 |
| 0.8131944444444444 | 51.951 |
| 0.813888888888889 | 51.951 |
| 0.8145833333333333 | 47.511 |
| 0.8152777777777778 | 47.511 |
| 0.8159722222222222 | 47.511 |
| 0.8166666666666668 | 47.511 |
| 0.8173611111111111 | 47.511 |
| 0.8180555555555555 | 47.511 |
| 0.81875 | 47.511 |
| 0.8194444444444445 | 47.511 |
| 0.8201388888888889 | 47.511 |
| 0.8208333333333333 | 47.511 |
| 0.8215277777777777 | 43.079 |
| 0.8222222222222223 | 43.079 |
| 0.8229166666666666 | 43.079 |
| 0.8236111111111111 | 43.079 |
| 0.8243055555555556 | 43.079 |
| 0.8250000000000001 | 38.653 |
| 0.8256944444444444 | 38.653 |
| 0.8263888888888888 | 38.653 |
| 0.8270833333333334 | 38.653 |
| 0.8277777777777778 | 38.653 |
| 0.8284722222222222 | 34.234 |
| 0.8291666666666666 | 34.234 |
| 0.8298611111111112 | 29.823 |
| 0.8305555555555556 | 29.823 |
| 0.8312499999999999 | 29.823 |
| 0.8319444444444444 | 29.823 |
| 0.8326388888888889 | 29.823 |
| 0.8333333333333334 | 25.419 |
| 0.8340277777777777 | 25.419 |
| 0.8347222222222223 | 21.024 |
| 0.8354166666666667 | 21.024 |
| 0.8361111111111111 | 21.024 |
| 0.8368055555555555 | 21.024 |
| 0.8375 | 16.636 |
| 0.8381944444444445 | 16.636 |
| 0.8388888888888889 | 16.636 |
| 0.8395833333333332 | 12.257 |
| 0.8402777777777778 | 12.257 |
| 0.8409722222222222 | 12.257 |
| 0.8416666666666667 | 12.257 |
| 0.842361111111111 | 12.257 |
| 0.8430555555555556 | 7.887 |
| 0.84375 | 7.887 |
| 0.8444444444444444 | 7.887 |
| 0.845138888888889 | 7.887 |
| 0.8458333333333333 | 7.887 |
| 0.8465277777777778 | 3.525 |
| 0.8472222222222222 | 3.525 |
| 0.8479166666666668 | 3.525 |
| 0.8486111111111111 | 3.525 |
| 0.8493055555555555 | 3.525 |
| 0.85 | 3.525 |
| 0.8506944444444445 | 3.525 |
| 0.8513888888888889 | 3.525 |
| 0.8520833333333333 | 3.525 |
| 0.8527777777777777 | 3.525 |
| 0.8534722222222223 | 3.525 |
| 0.8541666666666666 | 0 |
| 0.8548611111111111 | 0 |
| 0.8555555555555556 | 0 |
| 0.8562500000000001 | 0 |
| 0.8569444444444444 | 0 |
| 0.8576388888888888 | 0 |
| 0.8583333333333334 | 0 |
| 0.8590277777777778 | 0 |
| 0.8597222222222222 | 0 |
| 0.8604166666666666 | 0 |
| 0.8611111111111112 | 0 |
| 0.8618055555555556 | 0 |
| 0.8624999999999999 | 0 |
| 0.8631944444444444 | 0 |
| 0.8638888888888889 | 0 |
| 0.8645833333333334 | 0 |
| 0.8652777777777777 | 0 |
| 0.8659722222222223 | 0 |
| 0.8666666666666667 | 0 |
| 0.8673611111111111 | 0 |
| 0.8680555555555555 | 0 |
| 0.86875 | 0 |
| 0.8694444444444445 | 0 |
| 0.8701388888888889 | 0 |
| 0.8708333333333332 | 0 |
| 0.8715277777777778 | 0 |
| 0.8722222222222222 | 0 |
| 0.8729166666666667 | 0 |
| 0.873611111111111 | 0 |
| 0.8743055555555556 | 0 |
| 0.875 | 0 |
| 0.8756944444444444 | 0 |
| 0.876388888888889 | 0 |
| 0.8770833333333333 | 0 |
| 0.8777777777777778 | 0 |
| 0.8784722222222222 | 0 |
| 0.8791666666666668 | 0 |
| 0.8798611111111111 | 0 |
| 0.8805555555555555 | 0 |
| 0.88125 | 0 |
| 0.8819444444444445 | 0 |
| 0.8826388888888889 | 0 |
| 0.8833333333333333 | 0 |
| 0.8840277777777777 | 0 |
| 0.8847222222222223 | 0 |
| 0.8854166666666666 | 0 |
| 0.8861111111111111 | 0 |
| 0.8868055555555556 | 0 |
| 0.8875000000000001 | 0 |
| 0.8881944444444444 | 0 |
| 0.8888888888888888 | 0 |
| 0.8895833333333334 | 0 |
| 0.8902777777777778 | 0 |
| 0.8909722222222222 | 0 |
| 0.8916666666666666 | 0 |
| 0.8923611111111112 | 0 |
| 0.8930555555555556 | 0 |
| 0.8937499999999999 | 0 |
| 0.8944444444444444 | 0 |
| 0.8951388888888889 | 0 |
| 0.8958333333333334 | 0 |
| 0.8965277777777777 | 0 |
| 0.8972222222222223 | 0 |
| 0.8979166666666667 | 0 |
| 0.8986111111111111 | 0 |
| 0.8993055555555555 | 0 |
| 0.9 | 0 |
| 0.9006944444444445 | 0 |
| 0.9013888888888889 | 0 |
| 0.9020833333333332 | 0 |
| 0.9027777777777778 | 0 |
| 0.9034722222222222 | 0 |
| 0.9041666666666667 | 0 |
| 0.904861111111111 | 0 |
| 0.9055555555555556 | 0 |
| 0.90625 | 0 |
| 0.9069444444444444 | 0 |
| 0.907638888888889 | 0 |
| 0.9083333333333333 | 0 |
| 0.9090277777777778 | 0 |
| 0.9097222222222222 | 0 |
| 0.9104166666666668 | 0 |
| 0.9111111111111111 | 0 |
| 0.9118055555555555 | 0 |
| 0.9125 | 0 |
| 0.9131944444444445 | 0 |
| 0.9138888888888889 | 0 |
| 0.9145833333333333 | 0 |
| 0.9152777777777777 | 0 |
| 0.9159722222222223 | 0 |
| 0.9166666666666666 | 0 |
| 0.9173611111111111 | 0 |
| 0.9180555555555556 | 0 |
| 0.9187500000000001 | 0 |
| 0.9194444444444444 | 0 |
| 0.9201388888888888 | 0 |
| 0.9208333333333334 | 0 |
| 0.9215277777777778 | 0 |
| 0.9222222222222222 | 0 |
| 0.9229166666666666 | 0 |
| 0.9236111111111112 | 0 |
| 0.9243055555555556 | 0 |
| 0.9249999999999999 | 0 |
| 0.9256944444444444 | 0 |
| 0.9263888888888889 | 0 |
| 0.9270833333333334 | 0 |
| 0.9277777777777777 | 0 |
| 0.9284722222222223 | 0 |
| 0.9291666666666667 | 0 |
| 0.9298611111111111 | 0 |
| 0.9305555555555555 | 0 |
| 0.93125 | 0 |
| 0.9319444444444445 | 0 |
| 0.9326388888888889 | 0 |
| 0.9333333333333332 | 0 |
| 0.9340277777777778 | 0 |
| 0.9347222222222222 | 0 |
| 0.9354166666666667 | 0 |
| 0.936111111111111 | 0 |
| 0.9368055555555556 | 0 |
| 0.9375 | 0 |
| 0.9381944444444444 | 0 |
| 0.938888888888889 | 0 |
| 0.9395833333333333 | 0 |
| 0.9402777777777778 | 0 |
| 0.9409722222222222 | 0 |
| 0.9416666666666668 | 0 |
| 0.9423611111111111 | 0 |
| 0.9430555555555555 | 0 |
| 0.94375 | 0 |
| 0.9444444444444445 | 0 |
| 0.9451388888888889 | 0 |
| 0.9458333333333333 | 0 |
| 0.9465277777777777 | 0 |
| 0.9472222222222223 | 0 |
| 0.9479166666666666 | 0 |
| 0.9486111111111111 | 0 |
| 0.9493055555555556 | 0 |
| 0.9500000000000001 | 0 |
| 0.9506944444444444 | 0 |
| 0.9513888888888888 | 0 |
| 0.9520833333333334 | 0 |
| 0.9527777777777778 | 0 |
| 0.9534722222222222 | 0 |
| 0.9541666666666666 | 0 |
| 0.9548611111111112 | 0 |
| 0.9555555555555556 | 0 |
| 0.9562499999999999 | 0 |
| 0.9569444444444444 | 0 |
| 0.9576388888888889 | 0 |
| 0.9583333333333334 | 0 |
| 0.9590277777777777 | 0 |
| 0.9597222222222223 | 0 |
| 0.9604166666666667 | 0 |
| 0.9611111111111111 | 0 |
| 0.9618055555555555 | 0 |
| 0.9625 | 0 |
| 0.9631944444444445 | 0 |
| 0.9638888888888889 | 0 |
| 0.9645833333333332 | 0 |
| 0.9652777777777778 | 0 |
| 0.9659722222222222 | 0 |
| 0.9666666666666667 | 0 |
| 0.967361111111111 | 0 |
| 0.9680555555555556 | 0 |
| 0.96875 | 0 |
| 0.9694444444444444 | 0 |
| 0.970138888888889 | 0 |
| 0.9708333333333333 | 0 |
| 0.9715277777777778 | 0 |
| 0.9722222222222222 | 0 |
| 0.9729166666666668 | 0 |
| 0.9736111111111111 | 0 |
| 0.9743055555555555 | 0 |
| 0.975 | 0 |
| 0.9756944444444445 | 0 |
| 0.9763888888888889 | 0 |
| 0.9770833333333333 | 0 |
| 0.9777777777777777 | 0 |
| 0.9784722222222223 | 0 |
| 0.9791666666666666 | 0 |
| 0.9798611111111111 | 0 |
| 0.9805555555555556 | 0 |
| 0.9812500000000001 | 0 |
| 0.9819444444444444 | 0 |
| 0.9826388888888888 | 0 |
| 0.9833333333333334 | 0 |
| 0.9840277777777778 | 0 |
| 0.9847222222222222 | 0 |
| 0.9854166666666666 | 0 |
| 0.9861111111111112 | 0 |
| 0.9868055555555556 | 0 |
| 0.9874999999999999 | 0 |
| 0.9881944444444444 | 0 |
| 0.9888888888888889 | 0 |
| 0.9895833333333334 | 0 |
| 0.9902777777777777 | 0 |
| 0.9909722222222223 | 0 |
| 0.9916666666666667 | 0 |
| 0.9923611111111111 | 0 |
| 0.9930555555555555 | 0 |
| 0.99375 | 0 |
| 0.9944444444444445 | 0 |
| 0.9951388888888889 | 0 |
| 0.9958333333333332 | 0 |
| 0.9965277777777778 | 0 |
| 0.9972222222222222 | 0 |
| 0.9979166666666667 | 0 |
| 0.998611111111111 | 0 |
| 0.9993055555555556 | 0 |